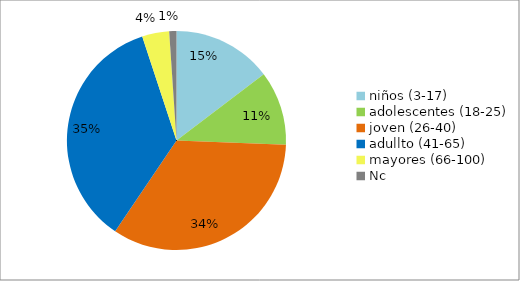
| Category | Series 0 |
|---|---|
| niños (3-17) | 55 |
| adolescentes (18-25) | 41 |
| joven (26-40) | 127 |
| adullto (41-65) | 133 |
| mayores (66-100) | 15 |
| Nc | 4 |